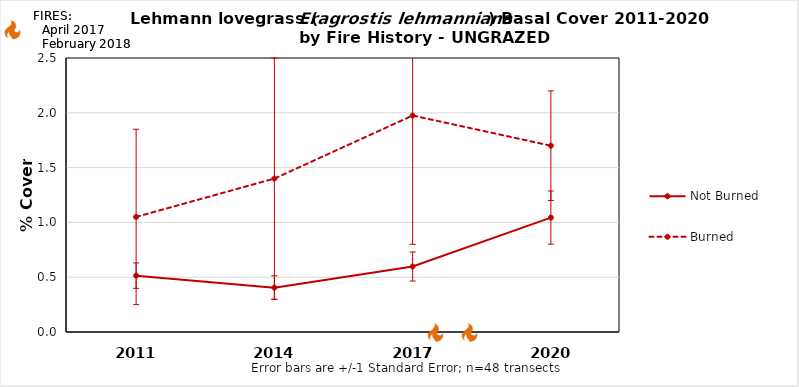
| Category | Not Burned | Burned |
|---|---|---|
| 2011.0 | 0.514 | 1.05 |
| 2014.0 | 0.405 | 1.4 |
| 2017.0 | 0.598 | 1.975 |
| 2020.0 | 1.044 | 1.7 |